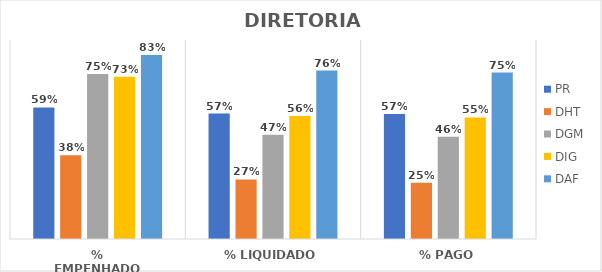
| Category | PR | DHT | DGM | DIG | DAF |
|---|---|---|---|---|---|
| % EMPENHADO | 0.595 | 0.379 | 0.746 | 0.733 | 0.832 |
| % LIQUIDADO | 0.567 | 0.269 | 0.471 | 0.557 | 0.762 |
| % PAGO | 0.566 | 0.254 | 0.463 | 0.55 | 0.753 |